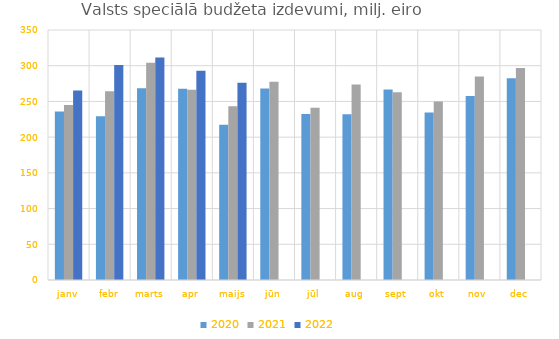
| Category | 2020 | 2021 | 2022 |
|---|---|---|---|
| janv | 235781.445 | 245021.603 | 265366.62 |
| febr | 229202.237 | 264114.802 | 301122.134 |
| marts | 268426.032 | 304192.595 | 311449.105 |
| apr | 267906.805 | 266305.843 | 292908.695 |
| maijs | 217225.441 | 243231.118 | 276006.043 |
| jūn | 268178.04 | 277705.46 | 0 |
| jūl | 232397.631 | 241038.074 | 0 |
| aug | 232000.053 | 273534.561 | 0 |
| sept | 266855.812 | 262890.697 | 0 |
| okt | 234655.305 | 249947.821 | 0 |
| nov | 257570.365 | 284917.624 | 0 |
| dec | 282446.284 | 296686.983 | 0 |